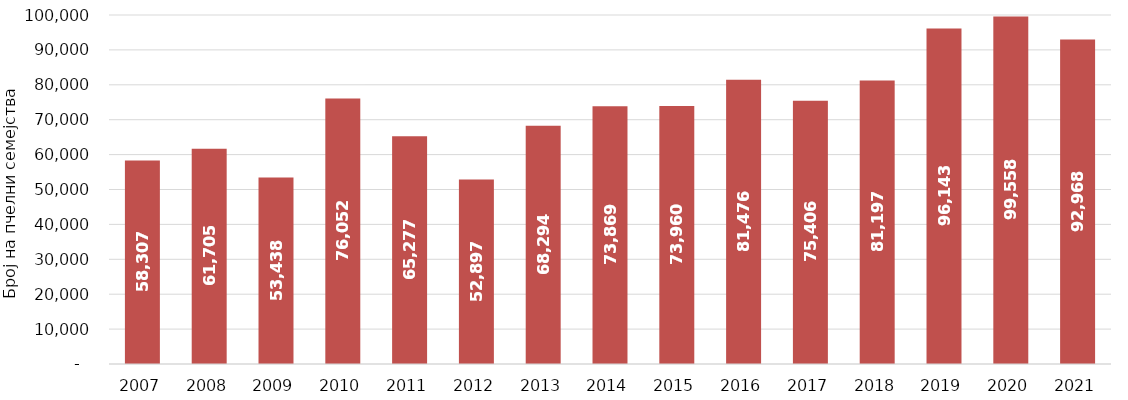
| Category | Пчелни семејства |
|---|---|
| 2007 | 58307 |
| 2008 | 61705 |
| 2009 | 53438 |
| 2010 | 76052 |
| 2011 | 65277 |
| 2012 | 52897 |
| 2013 | 68294 |
| 2014 | 73869 |
| 2015 | 73960 |
| 2016 | 81476 |
| 2017 | 75406 |
| 2018 | 81197 |
| 2019 | 96143 |
| 2020 | 99558 |
| 2021 | 92968 |